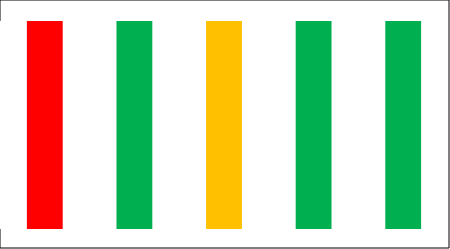
| Category | 1-3 | 4-6 | 7-10 |
|---|---|---|---|
| 0 | 0 | 0 | 1 |
| 1 | 1 | 0 | 0 |
| 2 | 0 | 1 | 0 |
| 3 | 1 | 0 | 0 |
| 4 | 1 | 0 | 0 |